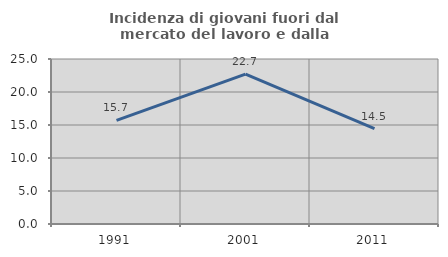
| Category | Incidenza di giovani fuori dal mercato del lavoro e dalla formazione  |
|---|---|
| 1991.0 | 15.7 |
| 2001.0 | 22.705 |
| 2011.0 | 14.465 |